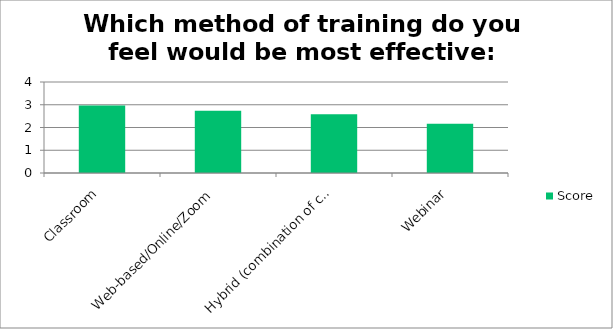
| Category | Score |
|---|---|
| Classroom | 2.97 |
| Web-based/Online/Zoom | 2.74 |
| Hybrid (combination of classroom and web-based instruction) | 2.58 |
| Webinar | 2.16 |